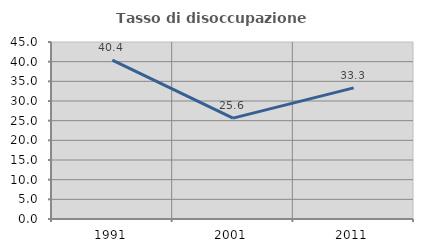
| Category | Tasso di disoccupazione giovanile  |
|---|---|
| 1991.0 | 40.379 |
| 2001.0 | 25.641 |
| 2011.0 | 33.333 |